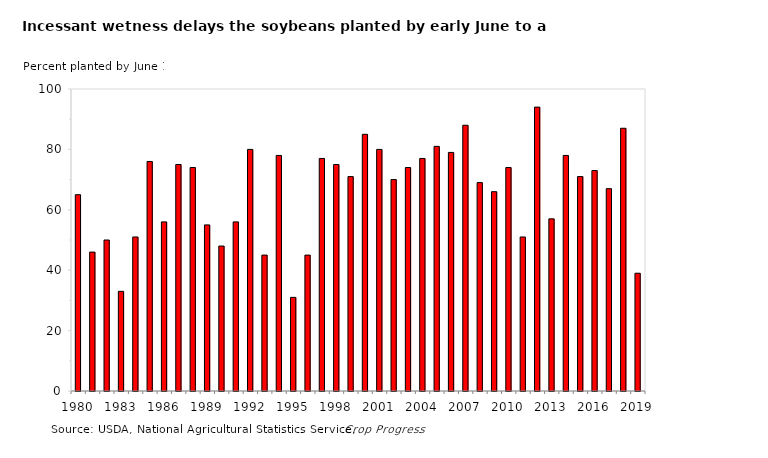
| Category | Percent planted |
|---|---|
| 1980.0 | 65 |
| 1981.0 | 46 |
| 1982.0 | 50 |
| 1983.0 | 33 |
| 1984.0 | 51 |
| 1985.0 | 76 |
| 1986.0 | 56 |
| 1987.0 | 75 |
| 1988.0 | 74 |
| 1989.0 | 55 |
| 1990.0 | 48 |
| 1991.0 | 56 |
| 1992.0 | 80 |
| 1993.0 | 45 |
| 1994.0 | 78 |
| 1995.0 | 31 |
| 1996.0 | 45 |
| 1997.0 | 77 |
| 1998.0 | 75 |
| 1999.0 | 71 |
| 2000.0 | 85 |
| 2001.0 | 80 |
| 2002.0 | 70 |
| 2003.0 | 74 |
| 2004.0 | 77 |
| 2005.0 | 81 |
| 2006.0 | 79 |
| 2007.0 | 88 |
| 2008.0 | 69 |
| 2009.0 | 66 |
| 2010.0 | 74 |
| 2011.0 | 51 |
| 2012.0 | 94 |
| 2013.0 | 57 |
| 2014.0 | 78 |
| 2015.0 | 71 |
| 2016.0 | 73 |
| 2017.0 | 67 |
| 2018.0 | 87 |
| 2019.0 | 39 |